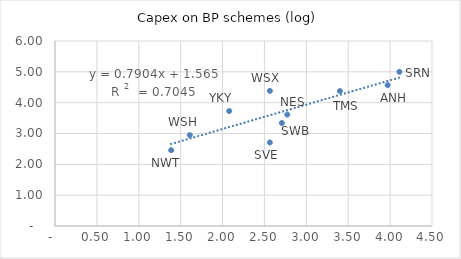
| Category | Series 0 |
|---|---|
| 3.970291913552122 | 4.569 |
| 2.772588722239781 | 3.613 |
| 1.3862943611198906 | 2.459 |
| 4.110873864173311 | 5 |
| 2.5649493574615367 | 2.709 |
| 2.70805020110221 | 3.34 |
| 3.4011973816621555 | 4.376 |
| 1.6094379124341003 | 2.948 |
| 2.5649493574615367 | 4.381 |
| 2.0794415416798357 | 3.728 |